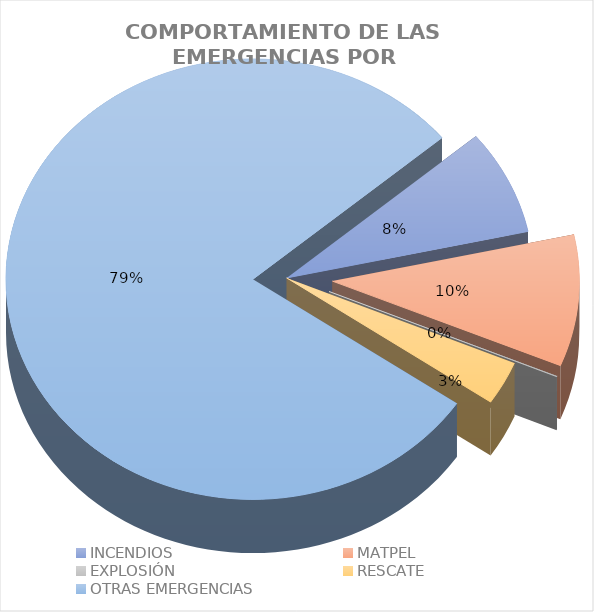
| Category | Series 0 |
|---|---|
| INCENDIOS | 0.077 |
| MATPEL | 0.097 |
| EXPLOSIÓN | 0.001 |
| RESCATE | 0.032 |
| OTRAS EMERGENCIAS | 0.794 |